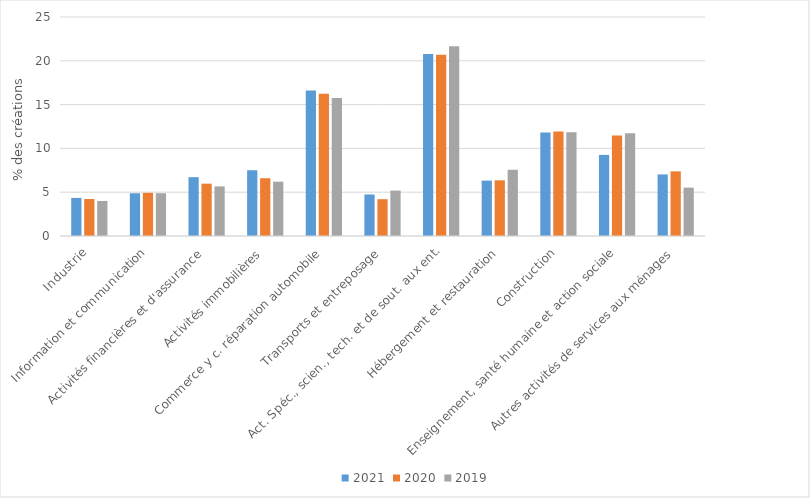
| Category | 2021 | 2020 | 2019 |
|---|---|---|---|
| Industrie | 4.347 | 4.221 | 4 |
| Information et communication | 4.883 | 4.926 | 4.881 |
| Activités financières et d'assurance | 6.717 | 5.974 | 5.661 |
| Activités immobilières | 7.508 | 6.596 | 6.203 |
| Commerce y c. réparation automobile | 16.596 | 16.25 | 15.763 |
| Transports et entreposage | 4.742 | 4.202 | 5.186 |
| Act. Spéc., scien., tech. et de sout. aux ent. | 20.773 | 20.69 | 21.661 |
| Hébergement et restauration | 6.322 | 6.355 | 7.559 |
| Construction | 11.826 | 11.92 | 11.831 |
| Enseignement, santé humaine et action sociale | 9.258 | 11.485 | 11.729 |
| Autres activités de services aux ménages | 7.028 | 7.38 | 5.525 |